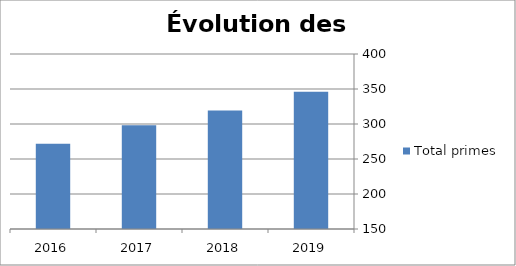
| Category | Total primes |
|---|---|
| 2019.0 | 346109.71 |
| 2018.0 | 319438.22 |
| 2017.0 | 298219.92 |
| 2016.0 | 271623.47 |